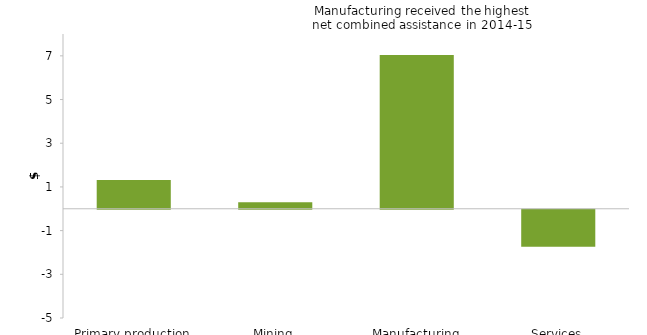
| Category | Net combined assistance |
|---|---|
| Primary production | 1.322 |
| Mining | 0.299 |
| Manufacturing | 7.04 |
| Services | -1.694 |